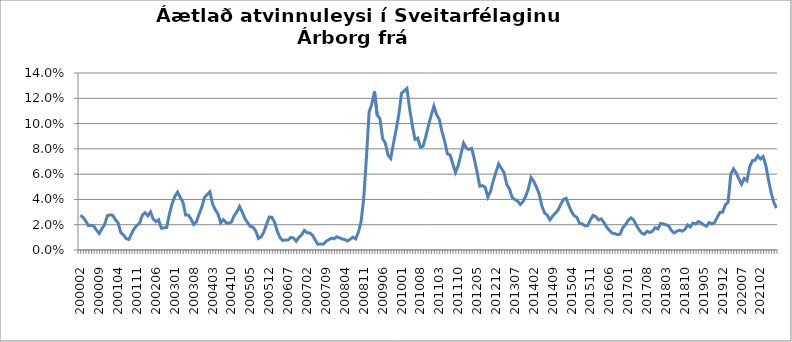
| Category | Series 0 |
|---|---|
| 200002 | 0.027 |
| 200003 | 0.026 |
| 200004 | 0.023 |
| 200005 | 0.019 |
| 200006 | 0.02 |
| 200007 | 0.019 |
| 200008 | 0.016 |
| 200009 | 0.013 |
| 200010 | 0.017 |
| 200011 | 0.02 |
| 200012 | 0.027 |
| 200101 | 0.028 |
| 200102 | 0.027 |
| 200103 | 0.024 |
| 200104 | 0.021 |
| 200105 | 0.014 |
| 200106 | 0.012 |
| 200107 | 0.009 |
| 200108 | 0.008 |
| 200109 | 0.013 |
| 200110 | 0.017 |
| 200111 | 0.02 |
| 200112 | 0.021 |
| 200201 | 0.028 |
| 200202 | 0.03 |
| 200203 | 0.027 |
| 200204 | 0.03 |
| 200205 | 0.025 |
| 200206 | 0.022 |
| 200207 | 0.024 |
| 200208 | 0.017 |
| 200209 | 0.018 |
| 200210 | 0.018 |
| 200211 | 0.028 |
| 200212 | 0.037 |
| 200301 | 0.042 |
| 200302 | 0.046 |
| 200303 | 0.042 |
| 200304 | 0.038 |
| 200305 | 0.028 |
| 200306 | 0.028 |
| 200307 | 0.025 |
| 200308 | 0.02 |
| 200309 | 0.022 |
| 200310 | 0.028 |
| 200311 | 0.034 |
| 200312 | 0.042 |
| 200401 | 0.044 |
| 200402 | 0.046 |
| 200403 | 0.036 |
| 200404 | 0.032 |
| 200405 | 0.029 |
| 200406 | 0.022 |
| 200407 | 0.024 |
| 200408 | 0.022 |
| 200409 | 0.021 |
| 200410 | 0.022 |
| 200411 | 0.027 |
| 200412 | 0.03 |
| 200501 | 0.034 |
| 200502 | 0.03 |
| 200503 | 0.025 |
| 200504 | 0.022 |
| 200505 | 0.019 |
| 200506 | 0.018 |
| 200507 | 0.015 |
| 200508 | 0.009 |
| 200509 | 0.01 |
| 200510 | 0.014 |
| 200511 | 0.02 |
| 200512 | 0.026 |
| 200601 | 0.026 |
| 200602 | 0.022 |
| 200603 | 0.015 |
| 200604 | 0.01 |
| 200605 | 0.008 |
| 200606 | 0.008 |
| 200607 | 0.008 |
| 200608 | 0.01 |
| 200609 | 0.009 |
| 200610 | 0.007 |
| 200611 | 0.01 |
| 200612 | 0.012 |
| 200701 | 0.015 |
| 200702 | 0.014 |
| 200703 | 0.013 |
| 200704 | 0.012 |
| 200705 | 0.008 |
| 200706 | 0.005 |
| 200707 | 0.005 |
| 200708 | 0.005 |
| 200709 | 0.007 |
| 200710 | 0.008 |
| 200711 | 0.009 |
| 200712 | 0.009 |
| 200801 | 0.01 |
| 200802 | 0.01 |
| 200803 | 0.009 |
| 200804 | 0.008 |
| 200805 | 0.007 |
| 200806 | 0.009 |
| 200807 | 0.01 |
| 200808 | 0.009 |
| 200809 | 0.014 |
| 200810 | 0.022 |
| 200811 | 0.041 |
| 200812 | 0.073 |
| 200901 | 0.109 |
| 200902 | 0.116 |
| 200903 | 0.125 |
| 200904 | 0.107 |
| 200905 | 0.104 |
| 200906 | 0.088 |
| 200907 | 0.085 |
| 200908 | 0.075 |
| 200909 | 0.072 |
| 200910 | 0.084 |
| 200911 | 0.095 |
| 200912 | 0.107 |
| 201001 | 0.124 |
| 201002 | 0.126 |
| 201003 | 0.128 |
| 201004 | 0.112 |
| 201005 | 0.099 |
| 201006 | 0.087 |
| 201007 | 0.089 |
| 201008 | 0.081 |
| 201009 | 0.082 |
| 201010 | 0.09 |
| 201011 | 0.099 |
| 201012 | 0.107 |
| 201101 | 0.114 |
| 201102 | 0.107 |
| 201103 | 0.103 |
| 201104 | 0.094 |
| 201105 | 0.086 |
| 201106 | 0.076 |
| 201107 | 0.075 |
| 201108 | 0.068 |
| 201109 | 0.061 |
| 201110 | 0.067 |
| 201111 | 0.076 |
| 201112 | 0.085 |
| 201201 | 0.081 |
| 201202 | 0.08 |
| 201203 | 0.08 |
| 201204 | 0.072 |
| 201205 | 0.062 |
| 201206 | 0.05 |
| 201207 | 0.051 |
| 201208 | 0.049 |
| 201209 | 0.042 |
| 201210 | 0.046 |
| 201211 | 0.055 |
| 201212 | 0.062 |
| 201301 | 0.068 |
| 201302 | 0.065 |
| 201303 | 0.061 |
| 201304 | 0.052 |
| 201305 | 0.048 |
| 201306 | 0.042 |
| 201307 | 0.04 |
| 201308 | 0.039 |
| 201309 | 0.036 |
| 201310 | 0.038 |
| 201311 | 0.042 |
| 201312 | 0.048 |
| 201401 | 0.057 |
| 201402 | 0.054 |
| 201403 | 0.05 |
| 201404 | 0.044 |
| 201405 | 0.035 |
| 201406 | 0.029 |
| 201407 | 0.028 |
| 201408 | 0.024 |
| 201409 | 0.027 |
| 201410 | 0.029 |
| 201411 | 0.032 |
| 201412 | 0.036 |
| 201501 | 0.04 |
| 201502 | 0.041 |
| 201503 | 0.035 |
| 201504 | 0.03 |
| 201505 | 0.027 |
| 201506 | 0.026 |
| 201507 | 0.021 |
| 201508 | 0.021 |
| 201509 | 0.019 |
| 201510 | 0.019 |
| 201511 | 0.024 |
| 201512 | 0.027 |
| 201601 | 0.026 |
| 201602 | 0.024 |
| 201603 | 0.025 |
| 201604 | 0.022 |
| 201605 | 0.018 |
| 201606 | 0.016 |
| 201607 | 0.013 |
| 201608 | 0.013 |
| 201609 | 0.012 |
| 201610 | 0.013 |
| 201611 | 0.018 |
| 201612 | 0.02 |
| 201701 | 0.024 |
| 201702 | 0.025 |
| 201703 | 0.024 |
| 201704 | 0.02 |
| 201705 | 0.016 |
| 201706 | 0.013 |
| 201707 | 0.012 |
| 201708 | 0.015 |
| 201709 | 0.014 |
| 201710 | 0.015 |
| 201711 | 0.018 |
| 201712 | 0.017 |
| 201801 | 0.021 |
| 201802 | 0.021 |
| 201803 | 0.02 |
| 201804 | 0.019 |
| 201805 | 0.015 |
| 201806 | 0.013 |
| 201807 | 0.015 |
| 201808 | 0.016 |
| 201809 | 0.015 |
| 201810 | 0.016 |
| 201811 | 0.02 |
| 201812 | 0.018 |
| 201901 | 0.021 |
| 201902 | 0.021 |
| 201903 | 0.023 |
| 201904 | 0.021 |
| 201905 | 0.02 |
| 201906 | 0.019 |
| 201907 | 0.022 |
| 201908 | 0.021 |
| 201909 | 0.022 |
| 201910 | 0.026 |
| 201911 | 0.03 |
| 201912 | 0.03 |
| 202001 | 0.036 |
| 202002 | 0.038 |
| 202003 | 0.06 |
| 202004 | 0.064 |
| 202005 | 0.061 |
| 202006 | 0.056 |
| 202007 | 0.052 |
| 202008 | 0.057 |
| 202009 | 0.055 |
| 202010 | 0.066 |
| 202011 | 0.071 |
| 202012 | 0.071 |
| 202101 | 0.074 |
| 202102 | 0.072 |
| 202103 | 0.074 |
| 202104 | 0.067 |
| 202105 | 0.055 |
| 202106 | 0.045 |
| 202107 | 0.037 |
| 202108 | 0.033 |